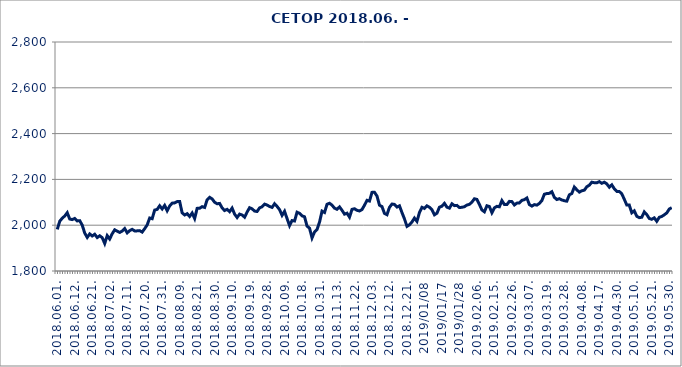
| Category | CETOP |
|---|---|
| 2018.06.01. | 1981.607 |
| 2018.06.04. | 2017.379 |
| 2018.06.05. | 2030.57 |
| 2018.06.06. | 2040.195 |
| 2018.06.07. | 2054.549 |
| 2018.06.08. | 2026.941 |
| 2018.06.11. | 2024.503 |
| 2018.06.12. | 2029.551 |
| 2018.06.13. | 2018.61 |
| 2018.06.14. | 2019.788 |
| 2018.06.15. | 2000.297 |
| 2018.06.18. | 1965.713 |
| 2018.06.19. | 1946.535 |
| 2018.06.20. | 1961.945 |
| 2018.06.21. | 1952.863 |
| 2018.06.22. | 1960.475 |
| 2018.06.25. | 1946.032 |
| 2018.06.26. | 1953.878 |
| 2018.06.27. | 1945.559 |
| 2018.06.28. | 1920.09 |
| 2018.06.29. | 1954.479 |
| 2018.07.02. | 1939.762 |
| 2018.07.03. | 1962.624 |
| 2018.07.04. | 1979.793 |
| 2018.07.05. | 1973.884 |
| 2018.07.06. | 1968.41 |
| 2018.07.09. | 1974.196 |
| 2018.07.10. | 1985.28 |
| 2018.07.11. | 1966.571 |
| 2018.07.12. | 1976.141 |
| 2018.07.13. | 1981.892 |
| 2018.07.16. | 1974.924 |
| 2018.07.17. | 1975.254 |
| 2018.07.18. | 1976.278 |
| 2018.07.19. | 1969.906 |
| 2018.07.20. | 1984.979 |
| 2018.07.23. | 2001.025 |
| 2018.07.24. | 2031.395 |
| 2018.07.25. | 2028.303 |
| 2018.07.26. | 2066.067 |
| 2018.07.27. | 2069.026 |
| 2018.07.30. | 2084.845 |
| 2018.07.31. | 2070.985 |
| 2018.08.01. | 2086.424 |
| 2018.08.02. | 2063.149 |
| 2018.08.03. | 2083.848 |
| 2018.08.06. | 2096.272 |
| 2018.08.07. | 2097.369 |
| 2018.08.08. | 2103.062 |
| 2018.08.09. | 2103.669 |
| 2018.08.10. | 2053.985 |
| 2018.08.13. | 2044.675 |
| 2018.08.14. | 2050.336 |
| 2018.08.15. | 2038.076 |
| 2018.08.16. | 2053.282 |
| 2018.08.17. | 2029.237 |
| 2018.08.21. | 2073.528 |
| 2018.08.22. | 2074.081 |
| 2018.08.23. | 2080.932 |
| 2018.08.24. | 2077.489 |
| 2018.08.27. | 2110.84 |
| 2018.08.28. | 2121.74 |
| 2018.08.29. | 2114.778 |
| 2018.08.30. | 2100.306 |
| 2018.08.31. | 2093.626 |
| 2018.09.03. | 2095.064 |
| 2018.09.04. | 2075.524 |
| 2018.09.05. | 2064.011 |
| 2018.09.06. | 2069.342 |
| 2018.09.07. | 2059.094 |
| 2018.09.10. | 2074.752 |
| 2018.09.11. | 2048.405 |
| 2018.09.12. | 2033.609 |
| 2018.09.13. | 2048.437 |
| 2018.09.14. | 2044.669 |
| 2018.09.17. | 2035.145 |
| 2018.09.18. | 2057.368 |
| 2018.09.19. | 2076.376 |
| 2018.09.20. | 2071.472 |
| 2018.09.21. | 2061.603 |
| 2018.09.24. | 2059.922 |
| 2018.09.25. | 2075.697 |
| 2018.09.26. | 2080.405 |
| 2018.09.27. | 2092.125 |
| 2018.09.28. | 2088.019 |
| 2018.10.01. | 2081.721 |
| 2018.10.02. | 2077.783 |
| 2018.10.03. | 2093.707 |
| 2018.10.04. | 2081.947 |
| 2018.10.05. | 2067.958 |
| 2018.10.08. | 2043.078 |
| 2018.10.09. | 2060.729 |
| 2018.10.10. | 2028.707 |
| 2018.10.11. | 1998.129 |
| 2018.10.12. | 2020.267 |
| 2018.10.15. | 2018.392 |
| 2018.10.16. | 2056.747 |
| 2018.10.17. | 2051.812 |
| 2018.10.18. | 2040.854 |
| 2018.10.19. | 2036.722 |
| 2018.10.24. | 1995.93 |
| 2018.10.25. | 1986.844 |
| 2018.10.26. | 1944.458 |
| 2018.10.29. | 1970.626 |
| 2018.10.30. | 1981.597 |
| 2018.10.31. | 2013.278 |
| 2018.11.05. | 2061.555 |
| 2018.11.06. | 2055.53 |
| 2018.11.07. | 2091.353 |
| 2018.11.08. | 2095.811 |
| 2018.11.09. | 2087.516 |
| 2018.11.12. | 2074.427 |
| 2018.11.13. | 2069.375 |
| 2018.11.14. | 2080.014 |
| 2018.11.15. | 2065.08 |
| 2018.11.16. | 2048.304 |
| 2018.11.19. | 2052.459 |
| 2018.11.20. | 2035.179 |
| 2018.11.21. | 2069.042 |
| 2018.11.22. | 2071.897 |
| 2018.11.23. | 2064.961 |
| 2018.11.26. | 2062.049 |
| 2018.11.27. | 2068.398 |
| 2018.11.28. | 2087.286 |
| 2018.11.29. | 2108.668 |
| 2018.11.30. | 2105.427 |
| 2018.12.03. | 2143.383 |
| 2018.12.04. | 2143.814 |
| 2018.12.05. | 2127.321 |
| 2018.12.06. | 2087.284 |
| 2018.12.07. | 2081.313 |
| 2018.12.10. | 2051.553 |
| 2018.12.11. | 2045.722 |
| 2018.12.12. | 2078.031 |
| 2018.12.13. | 2092.443 |
| 2018.12.14. | 2090.878 |
| 2018.12.17. | 2079.25 |
| 2018.12.18. | 2084.564 |
| 2018.12.19. | 2055.14 |
| 2018.12.20. | 2027.516 |
| 2018.12.21. | 1994.836 |
| 2018.12.27. | 2001.756 |
| 2018.12.28. | 2014.016 |
| 2019.01.02 | 2031.121 |
| 2019.01.03 | 2016.826 |
| 2019.01.04 | 2055.256 |
| 2019.01.07 | 2078.094 |
| 2019.01.08 | 2073.253 |
| 2019.01.09 | 2084.527 |
| 2019.01.10 | 2078.321 |
| 2019.01.11 | 2067.45 |
| 2019.01.14 | 2045.39 |
| 2019.01.15 | 2052.39 |
| 2019.01.16 | 2078.533 |
| 2019.01.17 | 2082.94 |
| 2019.01.18 | 2095.309 |
| 2019.01.21 | 2078.764 |
| 2019.01.22 | 2074.351 |
| 2019.01.23 | 2093.498 |
| 2019.01.24 | 2085.448 |
| 2019.01.25 | 2086.531 |
| 2019.01.28 | 2076.959 |
| 2019.01.29 | 2078.238 |
| 2019.01.30 | 2080.718 |
| 2019.01.31 | 2088.041 |
| 2019.02.01. | 2090.951 |
| 2019.02.04. | 2100.785 |
| 2019.02.05. | 2115.365 |
| 2019.02.06. | 2112.788 |
| 2019.02.07. | 2090.842 |
| 2019.02.08. | 2066.561 |
| 2019.02.11. | 2058.484 |
| 2019.02.12. | 2084.853 |
| 2019.02.13. | 2081.616 |
| 2019.02.14. | 2054.353 |
| 2019.02.15. | 2075.739 |
| 2019.02.18. | 2082.306 |
| 2019.02.19. | 2080.333 |
| 2019.02.20. | 2107.518 |
| 2019.02.21. | 2090.457 |
| 2019.02.22. | 2090.114 |
| 2019.02.25. | 2104.067 |
| 2019.02.26. | 2103.168 |
| 2019.02.27. | 2088.35 |
| 2019.02.28. | 2096.423 |
| 2019.03.01. | 2097.164 |
| 2019.03.04. | 2108.472 |
| 2019.03.05. | 2111.589 |
| 2019.03.06. | 2118.905 |
| 2019.03.07. | 2089.945 |
| 2019.03.08. | 2083.449 |
| 2019.03.11. | 2089.829 |
| 2019.03.12. | 2087.626 |
| 2019.03.13. | 2095.071 |
| 2019.03.14. | 2107.598 |
| 2019.03.18. | 2135.183 |
| 2019.03.19. | 2138.259 |
| 2019.03.20. | 2139.093 |
| 2019.03.21. | 2146.287 |
| 2019.03.22. | 2121.71 |
| 2019.03.25. | 2112.164 |
| 2019.03.26. | 2115.894 |
| 2019.03.27. | 2110.252 |
| 2019.03.28. | 2106.846 |
| 2019.03.29. | 2104.986 |
| 2019.04.01. | 2132.574 |
| 2019.04.02. | 2138.374 |
| 2019.04.03. | 2166.651 |
| 2019.04.04. | 2154.718 |
| 2019.04.05. | 2144.455 |
| 2019.04.08. | 2150.202 |
| 2019.04.09. | 2153.045 |
| 2019.04.10. | 2167.895 |
| 2019.04.11. | 2174.854 |
| 2019.04.12. | 2187.792 |
| 2019.04.15. | 2185.484 |
| 2019.04.16. | 2185.305 |
| 2019.04.17. | 2190.201 |
| 2019.04.18. | 2182.992 |
| 2019.04.23. | 2187.796 |
| 2019.04.24. | 2180.508 |
| 2019.04.25. | 2165.991 |
| 2019.04.26. | 2176.261 |
| 2019.04.29. | 2159.18 |
| 2019.04.30. | 2147.64 |
| 2019.05.02. | 2147.386 |
| 2019.05.03. | 2136.927 |
| 2019.05.06. | 2113.432 |
| 2019.05.07. | 2087.889 |
| 2019.05.08. | 2087.837 |
| 2019.05.09. | 2054.158 |
| 2019.05.10. | 2062.71 |
| 2019.05.13. | 2038.936 |
| 2019.05.14. | 2033.011 |
| 2019.05.15. | 2034.809 |
| 2019.05.16. | 2058.039 |
| 2019.05.17. | 2046.341 |
| 2019.05.20. | 2029.475 |
| 2019.05.21. | 2025.854 |
| 2019.05.22. | 2032.113 |
| 2019.05.23. | 2017.154 |
| 2019.05.24. | 2034.381 |
| 2019.05.27. | 2038.296 |
| 2019.05.28. | 2045.236 |
| 2019.05.29. | 2053.447 |
| 2019.05.30. | 2070.528 |
| 2019.05.31. | 2076.617 |